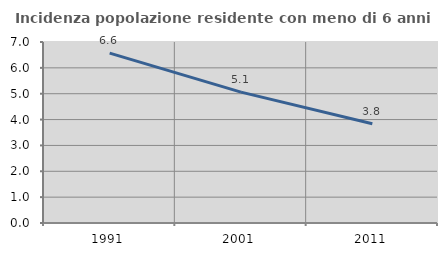
| Category | Incidenza popolazione residente con meno di 6 anni |
|---|---|
| 1991.0 | 6.569 |
| 2001.0 | 5.061 |
| 2011.0 | 3.837 |